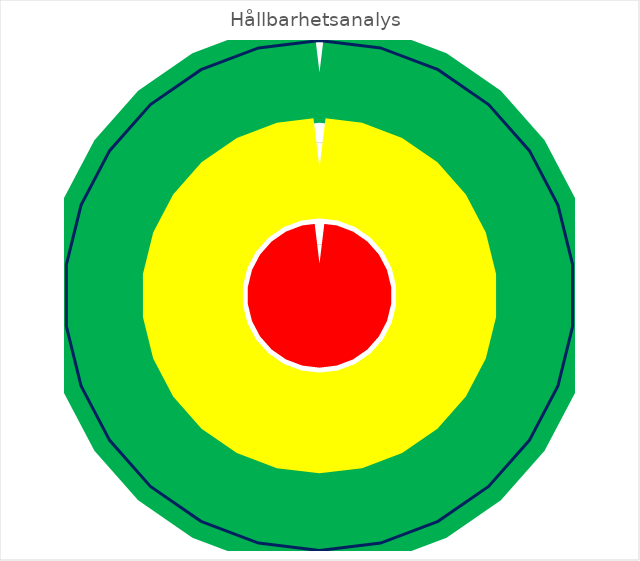
| Category | Ring1 | ring2 | ring3 | Värde |
|---|---|---|---|---|
| 0 | 87.5 | 50 | 12.5 | 100 |
| 1 | 87.5 | 50 | 12.5 | 100 |
| 2 | 87.5 | 50 | 12.5 | 100 |
| 3 | 87.5 | 50 | 12.5 | 100 |
| 4 | 87.5 | 50 | 12.5 | 100 |
| 5 | 87.5 | 50 | 12.5 | 100 |
| 6 | 87.5 | 50 | 12.5 | 100 |
| 7 | 87.5 | 50 | 12.5 | 100 |
| 8 | 87.5 | 50 | 12.5 | 100 |
| 9 | 87.5 | 50 | 12.5 | 100 |
| 10 | 87.5 | 50 | 12.5 | 100 |
| 11 | 87.5 | 50 | 12.5 | 100 |
| 12 | 87.5 | 50 | 12.5 | 100 |
| 13 | 87.5 | 50 | 12.5 | 100 |
| 14 | 87.5 | 50 | 12.5 | 100 |
| 15 | 87.5 | 50 | 12.5 | 100 |
| 16 | 87.5 | 50 | 12.5 | 100 |
| 17 | 87.5 | 50 | 12.5 | 100 |
| 18 | 87.5 | 50 | 12.5 | 100 |
| 19 | 87.5 | 50 | 12.5 | 100 |
| 20 | 87.5 | 50 | 12.5 | 100 |
| 21 | 87.5 | 50 | 12.5 | 100 |
| 22 | 87.5 | 50 | 12.5 | 100 |
| 23 | 87.5 | 50 | 12.5 | 100 |
| 24 | 87.5 | 50 | 12.5 | 100 |
| 25 | 87.5 | 50 | 12.5 | 100 |